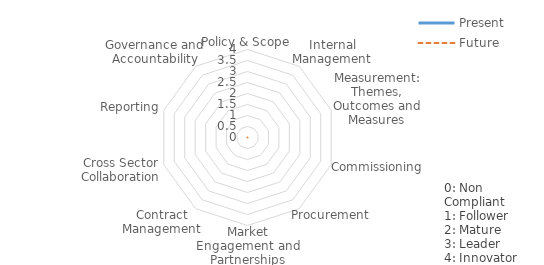
| Category | Present | Future |
|---|---|---|
| Policy & Scope | 0 | 0 |
| Internal Management | 0 | 0 |
| Measurement: Themes, Outcomes and Measures | 0 | 0 |
| Commissioning | 0 | 0 |
| Procurement | 0 | 0 |
| Market Engagement and Partnerships | 0 | 0 |
| Contract Management | 0 | 0 |
| Cross Sector Collaboration | 0 | 0 |
| Reporting | 0 | 0 |
| Governance and Accountability | 0 | 0 |